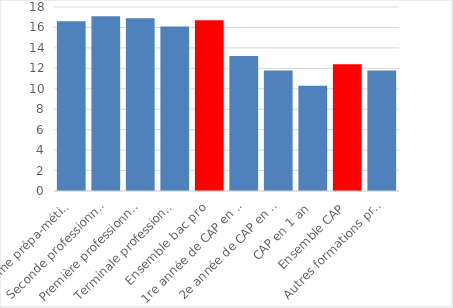
| Category | 2021 |
|---|---|
| Troisième prépa-métiers | 16.6 |
| Seconde professionnelle | 17.1 |
| Première professionnelle | 16.9 |
| Terminale professionnelle | 16.1 |
| Ensemble bac pro | 16.7 |
| 1re année de CAP en 2 ans | 13.2 |
| 2e année de CAP en 2 ans | 11.8 |
| CAP en 1 an | 10.3 |
| Ensemble CAP | 12.4 |
| Autres formations professionnelles | 11.8 |